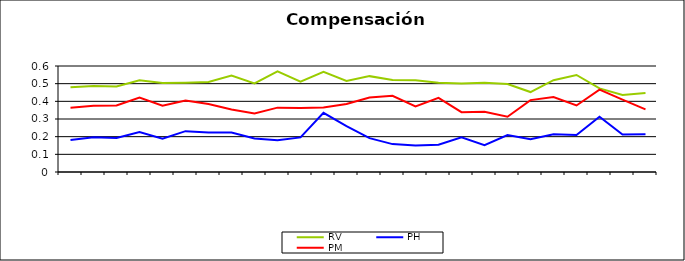
| Category | RV | PH | PM |
|---|---|---|---|
| 0 | 0.479 | 0.181 | 0.364 |
| 1 | 0.487 | 0.196 | 0.375 |
| 2 | 0.484 | 0.192 | 0.376 |
| 3 | 0.52 | 0.226 | 0.421 |
| 4 | 0.504 | 0.189 | 0.375 |
| 5 | 0.506 | 0.231 | 0.404 |
| 6 | 0.51 | 0.224 | 0.384 |
| 7 | 0.546 | 0.223 | 0.353 |
| 8 | 0.501 | 0.19 | 0.331 |
| 9 | 0.57 | 0.18 | 0.364 |
| 10 | 0.511 | 0.196 | 0.363 |
| 11 | 0.567 | 0.335 | 0.365 |
| 12 | 0.515 | 0.26 | 0.385 |
| 13 | 0.543 | 0.192 | 0.422 |
| 14 | 0.52 | 0.158 | 0.431 |
| 15 | 0.519 | 0.15 | 0.371 |
| 16 | 0.505 | 0.154 | 0.42 |
| 17 | 0.501 | 0.196 | 0.339 |
| 18 | 0.506 | 0.151 | 0.341 |
| 19 | 0.498 | 0.209 | 0.313 |
| 20 | 0.453 | 0.186 | 0.407 |
| 21 | 0.52 | 0.213 | 0.424 |
| 22 | 0.549 | 0.21 | 0.376 |
| 23 | 0.473 | 0.312 | 0.466 |
| 24 | 0.436 | 0.212 | 0.41 |
| 25 | 0.447 | 0.213 | 0.354 |